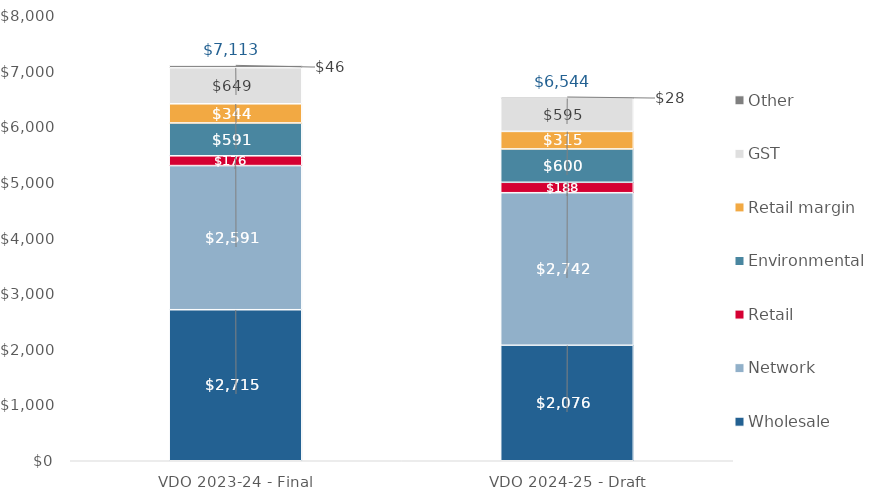
| Category | Wholesale | Network | Retail | Environmental | Retail margin | GST | Other |
|---|---|---|---|---|---|---|---|
| VDO 2023-24 - Final | 2715.103 | 2591.295 | 175.924 | 590.699 | 344.265 | 649.185 | 46.223 |
| VDO 2024-25 - Draft | 2076.321 | 2742.231 | 187.594 | 599.708 | 315.474 | 594.893 | 27.603 |